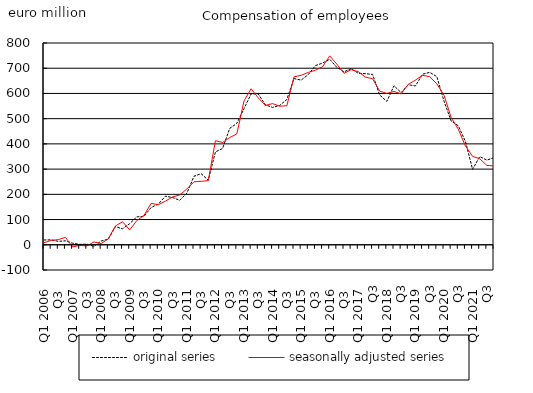
| Category | original series | seasonally adjusted series |
|---|---|---|
| Q1 2006 | 19.053 | 8.046 |
| Q2  | 19.489 | 17.165 |
| Q3  | 13.718 | 20.479 |
| Q4  | 15.632 | 29.517 |
| Q1 2007 | 6.337 | -8.334 |
| Q2  | 1.625 | -2.649 |
| Q3  | 2.482 | -4.266 |
| Q4  | -6.458 | 11.086 |
| Q1 2008 | 14.88 | 4.784 |
| Q2  | 22.43 | 23.56 |
| Q3  | 72.02 | 74.739 |
| Q4  | 63.489 | 91.092 |
| Q1 2009 | 83.933 | 59.088 |
| Q2  | 110.677 | 96.225 |
| Q3  | 113.013 | 116.511 |
| Q4  | 147.853 | 164.415 |
| Q1 2010 | 161.394 | 158.668 |
| Q2  | 192.643 | 173.085 |
| Q3  | 187.241 | 189.678 |
| Q4  | 176.285 | 197.44 |
| Q1 2011 | 204.319 | 221.109 |
| Q2  | 271.47 | 249.587 |
| Q3  | 281.894 | 251.749 |
| Q4  | 256.106 | 254.161 |
| Q1 2012 | 368.462 | 412.575 |
| Q2  | 381.668 | 405.675 |
| Q3  | 461.255 | 425.068 |
| Q4  | 481.275 | 439.762 |
| Q1 2013 | 539.407 | 570.317 |
| Q2  | 598.18 | 618.65 |
| Q3  | 597.854 | 582.235 |
| Q4  | 554.776 | 552.452 |
| Q1 2014 | 544.6 | 559.706 |
| Q2  | 552.46 | 549.52 |
| Q3  | 576.278 | 551.196 |
| Q4  | 658.911 | 665.83 |
| Q1 2015 | 652.864 | 671.89 |
| Q2  | 674.884 | 683.268 |
| Q3  | 710.096 | 692.055 |
| Q4 | 720.664 | 705.971 |
| Q1 2016 | 735.515 | 748.977 |
| Q2  | 703.232 | 716.19 |
| Q3  | 685.908 | 679.722 |
| Q4 | 698.222 | 694.289 |
| Q1 2017 | 679.929 | 686.125 |
| Q2  | 678.435 | 664.853 |
| Q3 | 675.362 | 658.244 |
| Q4 | 593.47 | 609.106 |
| Q1 2018 | 568.539 | 600.255 |
| Q2  | 630.453 | 607.793 |
| Q3 | 603.45 | 598.007 |
| Q4 | 634.784 | 636.151 |
| Q1 2019 | 629.598 | 652.845 |
| Q2  | 676.417 | 671.77 |
| Q3 | 683.648 | 666.545 |
| Q4 | 666.448 | 637.893 |
| Q1 2020 | 569.412 | 593.05 |
| Q2  | 491.057 | 504.619 |
| Q3 | 471.676 | 458.241 |
| Q4 | 409.767 | 392.034 |
| Q1 2021 | 299.147 | 350.477 |
| Q2  | 349.673 | 341.029 |
| Q3 | 335.75 | 314.747 |
| Q4 | 345.292 | 312.379 |